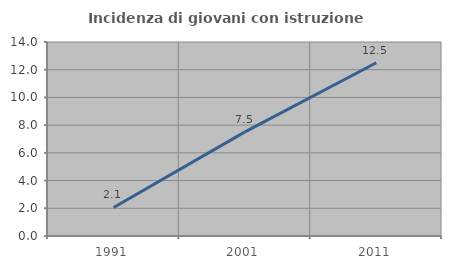
| Category | Incidenza di giovani con istruzione universitaria |
|---|---|
| 1991.0 | 2.062 |
| 2001.0 | 7.514 |
| 2011.0 | 12.5 |